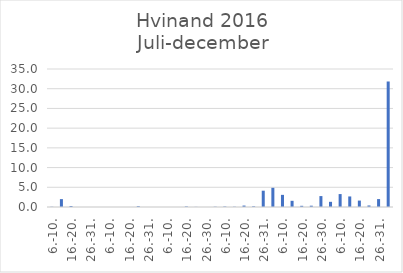
| Category | Series 0 |
|---|---|
| 6.-10. | 0.058 |
| 11.-15. | 2 |
| 16.-20. | 0.255 |
| 21.-25. | 0 |
| 26.-31. | 0 |
| 1.-5 | 0 |
| 6.-10. | 0 |
| 11.-15. | 0 |
| 16.-20. | 0 |
| 21.-25. | 0.202 |
| 26.-31. | 0 |
| 1.-5 | 0 |
| 6.-10. | 0 |
| 11.-15. | 0 |
| 16.-20. | 0.14 |
| 21.-25. | 0.032 |
| 26.-30. | 0 |
| 1.-5 | 0.071 |
| 6.-10. | 0.12 |
| 11.-15. | 0.071 |
| 16.-20. | 0.364 |
| 21.-25. | 0.177 |
| 26.-31. | 4.136 |
| 1.-5 | 4.869 |
| 6.-10. | 3.079 |
| 11.-15. | 1.571 |
| 16.-20. | 0.302 |
| 21.-25. | 0.329 |
| 26.-30. | 2.77 |
| 1.-5 | 1.313 |
| 6.-10. | 3.278 |
| 11.-15. | 2.677 |
| 16.-20. | 1.626 |
| 21.-25. | 0.386 |
| 26.-31. | 2.006 |
| I alt | 31.832 |